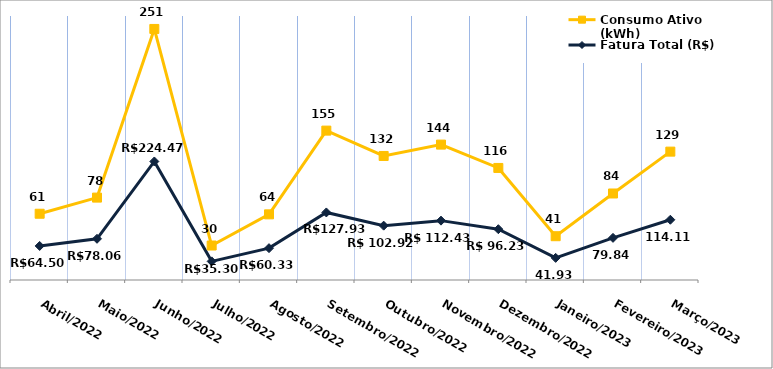
| Category | Fatura Total (R$) | Consumo Ativo (kWh) |
|---|---|---|
| Abril/2022 | 64.5 | 61 |
| Maio/2022 | 78.06 | 78 |
| Junho/2022 | 224.47 | 251 |
| Julho/2022 | 35.3 | 30 |
| Agosto/2022 | 60.33 | 64 |
| Setembro/2022 | 127.93 | 155 |
| Outubro/2022 | 102.92 | 132 |
| Novembro/2022 | 112.43 | 144 |
| Dezembro/2022 | 96.23 | 116 |
| Janeiro/2023 | 41.93 | 41 |
| Fevereiro/2023 | 79.84 | 84 |
| Março/2023 | 114.11 | 129 |